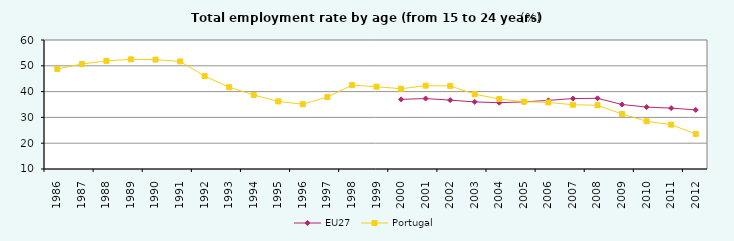
| Category | EU27 | Portugal |
|---|---|---|
| 1986 | 0 | 48.8 |
| 1987 | 0 | 50.7 |
| 1988 | 0 | 51.9 |
| 1989 | 0 | 52.5 |
| 1990 | 0 | 52.4 |
| 1991 | 0 | 51.7 |
| 1992 | 0 | 46 |
| 1993 | 0 | 41.7 |
| 1994 | 0 | 38.7 |
| 1995 | 0 | 36.2 |
| 1996 | 0 | 35.1 |
| 1997 | 0 | 37.9 |
| 1998 | 0 | 42.5 |
| 1999 | 0 | 41.9 |
| 2000 | 37 | 41.1 |
| 2001 | 37.3 | 42.3 |
| 2002 | 36.7 | 42.2 |
| 2003 | 36 | 39 |
| 2004 | 35.7 | 37.1 |
| 2005 | 36 | 36.1 |
| 2006 | 36.6 | 35.8 |
| 2007 | 37.3 | 34.9 |
| 2008 | 37.4 | 34.7 |
| 2009 | 35 | 31.3 |
| 2010 | 34 | 28.5 |
| 2011 | 33.6 | 27.2 |
| 2012 | 32.9 | 23.6 |